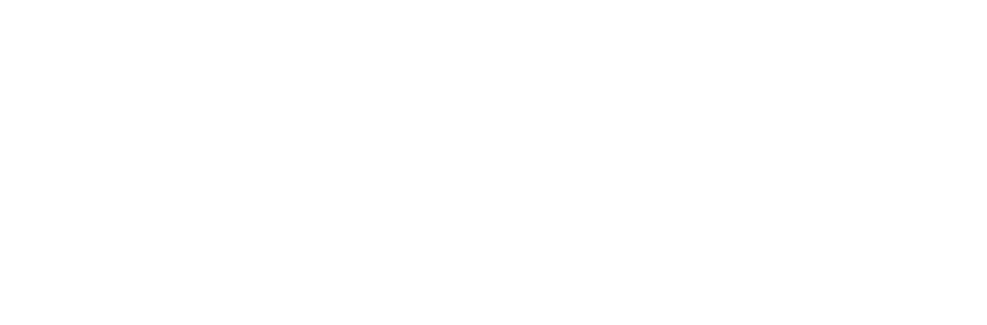
| Category | Total |
|---|---|
| 0 | 0.822 |
| 1 | 0.178 |
| 2 | 0.24 |
| 3 | 0.76 |
| 4 | 0.777 |
| 5 | 0.223 |